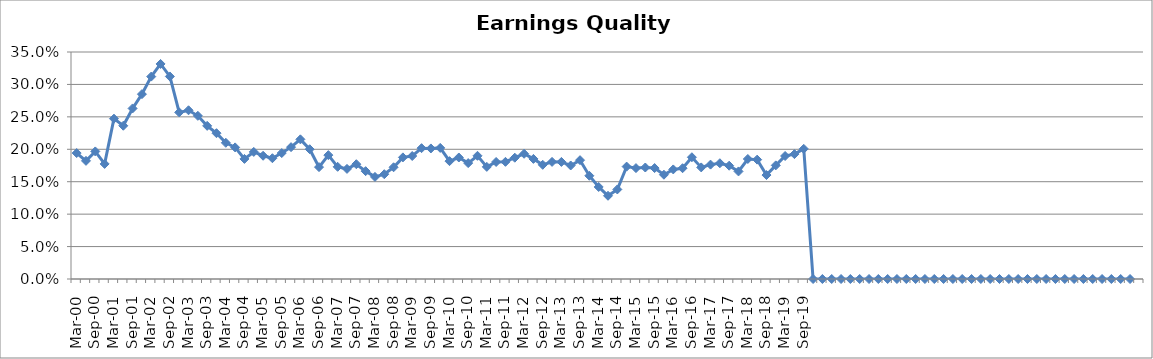
| Category | Rptd. Earnings Quality Indicator |
|---|---|
| Mar-00 | 0.194 |
| Jun-00 | 0.182 |
| Sep-00 | 0.197 |
| Dec-00 | 0.177 |
| Mar-01 | 0.247 |
| Jun-01 | 0.236 |
| Sep-01 | 0.263 |
| Dec-01 | 0.285 |
| Mar-02 | 0.312 |
| Jun-02 | 0.332 |
| Sep-02 | 0.312 |
| Dec-02 | 0.257 |
| Mar-03 | 0.26 |
| Jun-03 | 0.252 |
| Sep-03 | 0.236 |
| Dec-03 | 0.225 |
| Mar-04 | 0.21 |
| Jun-04 | 0.203 |
| Sep-04 | 0.185 |
| Dec-04 | 0.196 |
| Mar-05 | 0.19 |
| Jun-05 | 0.186 |
| Sep-05 | 0.194 |
| Dec-05 | 0.203 |
| Mar-06 | 0.215 |
| Jun-06 | 0.2 |
| Sep-06 | 0.173 |
| Dec-06 | 0.191 |
| Mar-07 | 0.173 |
| Jun-07 | 0.17 |
| Sep-07 | 0.177 |
| Dec-07 | 0.166 |
| Mar-08 | 0.157 |
| Jun-08 | 0.162 |
| Sep-08 | 0.172 |
| Dec-08 | 0.188 |
| Mar-09 | 0.19 |
| Jun-09 | 0.202 |
| Sep-09 | 0.201 |
| Dec-09 | 0.202 |
| Mar-10 | 0.182 |
| Jun-10 | 0.187 |
| Sep-10 | 0.179 |
| Dec-10 | 0.19 |
| Mar-11 | 0.173 |
| Jun-11 | 0.18 |
| Sep-11 | 0.181 |
| Dec-11 | 0.187 |
| Mar-12 | 0.193 |
| Jun-12 | 0.185 |
| Sep-12 | 0.176 |
| Dec-12 | 0.181 |
| Mar-13 | 0.181 |
| Jun-13 | 0.175 |
| Sep-13 | 0.183 |
| Dec-13 | 0.159 |
| Mar-14 | 0.142 |
| Jun-14 | 0.128 |
| Sep-14 | 0.138 |
| Dec-14 | 0.173 |
| Mar-15 | 0.171 |
| Jun-15 | 0.172 |
| Sep-15 | 0.171 |
| Dec-15 | 0.161 |
| Mar-16 | 0.169 |
| Jun-16 | 0.171 |
| Sep-16 | 0.188 |
| Dec-16 | 0.172 |
| Mar-17 | 0.176 |
| Jun-17 | 0.178 |
| Sep-17 | 0.175 |
| Dec-17 | 0.166 |
| Mar-18 | 0.185 |
| Jun-18 | 0.184 |
| Sep-18 | 0.16 |
| Dec-18 | 0.175 |
| Mar-19 | 0.19 |
| Jun-19 | 0.193 |
| Sep-19 | 0.201 |